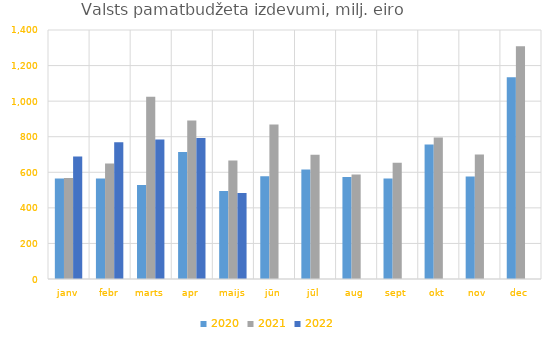
| Category | 2020 | 2021 | 2022 |
|---|---|---|---|
| janv | 564731.731 | 567519.181 | 689237.965 |
| febr | 564358.73 | 649337.389 | 769410.975 |
| marts | 528520.586 | 1024865.74 | 784728.56 |
| apr | 713875.034 | 890597.122 | 792151.693 |
| maijs | 494549.632 | 666390.632 | 483183.032 |
| jūn | 578082.287 | 868998.418 | 0 |
| jūl | 616330.617 | 698429.777 | 0 |
| aug | 573848.626 | 587185.295 | 0 |
| sept | 565735.173 | 652999.82 | 0 |
| okt | 755917.602 | 795708.656 | 0 |
| nov | 576740.78 | 700002.359 | 0 |
| dec | 1134353.728 | 1308324.606 | 0 |